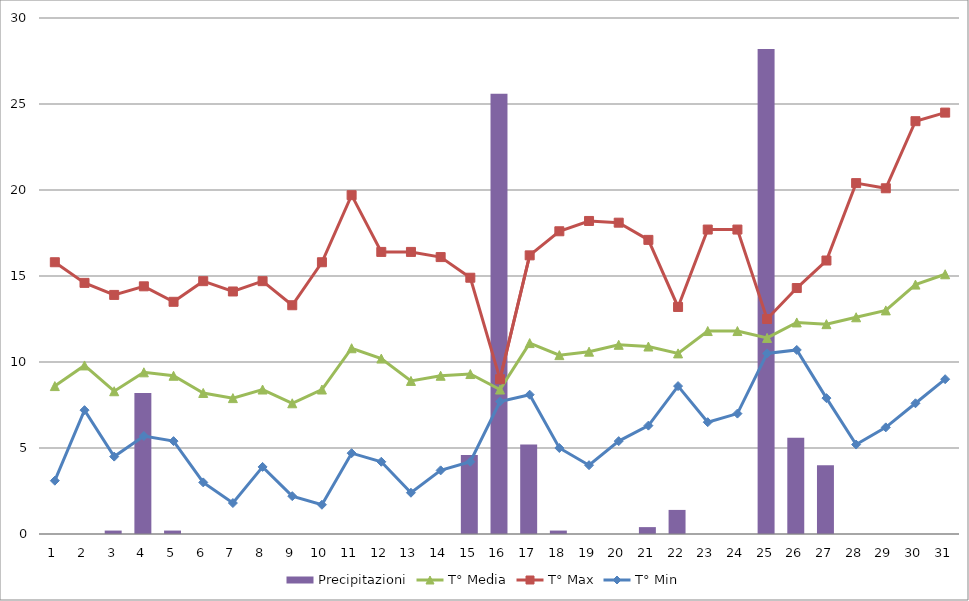
| Category | Precipitazioni |
|---|---|
| 0 | 0 |
| 1 | 0 |
| 2 | 0.2 |
| 3 | 8.2 |
| 4 | 0.2 |
| 5 | 0 |
| 6 | 0 |
| 7 | 0 |
| 8 | 0 |
| 9 | 0 |
| 10 | 0 |
| 11 | 0 |
| 12 | 0 |
| 13 | 0 |
| 14 | 4.6 |
| 15 | 25.6 |
| 16 | 5.2 |
| 17 | 0.2 |
| 18 | 0 |
| 19 | 0 |
| 20 | 0.4 |
| 21 | 1.4 |
| 22 | 0 |
| 23 | 0 |
| 24 | 28.2 |
| 25 | 5.6 |
| 26 | 4 |
| 27 | 0 |
| 28 | 0 |
| 29 | 0 |
| 30 | 0 |